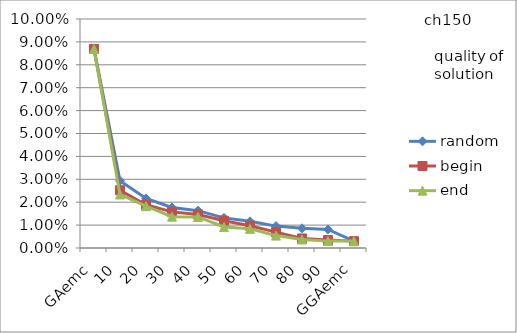
| Category | random | begin | end |
|---|---|---|---|
| 0 | 0.087 | 0.087 | 0.087 |
| 1 | 0.029 | 0.025 | 0.023 |
| 2 | 0.022 | 0.019 | 0.018 |
| 3 | 0.018 | 0.016 | 0.014 |
| 4 | 0.016 | 0.015 | 0.014 |
| 5 | 0.013 | 0.012 | 0.009 |
| 6 | 0.012 | 0.01 | 0.008 |
| 7 | 0.01 | 0.007 | 0.005 |
| 8 | 0.009 | 0.004 | 0.004 |
| 9 | 0.008 | 0.003 | 0.003 |
| 10 | 0.003 | 0.003 | 0.003 |